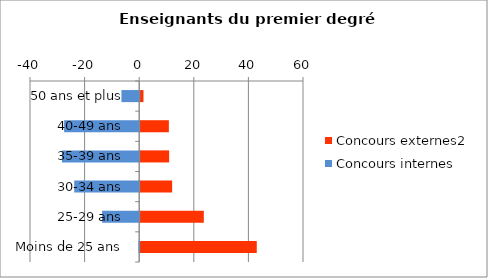
| Category | Concours externes2 | Concours internes |
|---|---|---|
| 50 ans et plus | 1.2 | -6.5 |
| 40-49 ans | 10.5 | -27.5 |
| 35-39 ans | 10.6 | -28.3 |
| 30-34 ans | 11.7 | -23.8 |
| 25-29 ans | 23.3 | -13.6 |
| Moins de 25 ans | 42.7 | -0.3 |